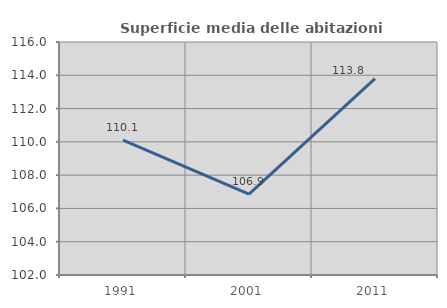
| Category | Superficie media delle abitazioni occupate |
|---|---|
| 1991.0 | 110.101 |
| 2001.0 | 106.862 |
| 2011.0 | 113.8 |